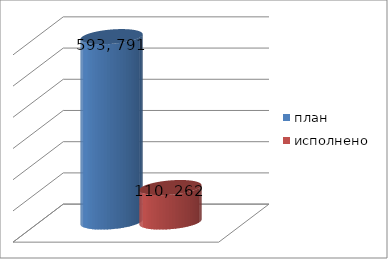
| Category | план | исполнено |
|---|---|---|
| 0 | 593791731.66 | 110262257.25 |